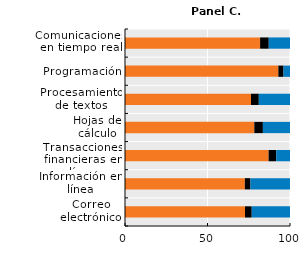
| Category | Nunca  | Menos de una vez por semana | Al menos una vez por semana |
|---|---|---|---|
| Correo electrónico | 72.741 | 4.063 | 23.196 |
| Información en línea | 72.647 | 3.388 | 23.965 |
| Transacciones financieras en línea | 87.018 | 4.67 | 8.312 |
| Hojas de cálculo | 78.373 | 5.201 | 16.426 |
| Procesamiento de textos | 76.37 | 4.728 | 18.902 |
| Programación | 92.947 | 3.121 | 3.932 |
| Comunicaciones en tiempo real | 81.879 | 5.246 | 12.875 |